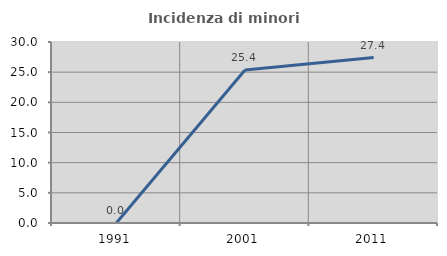
| Category | Incidenza di minori stranieri |
|---|---|
| 1991.0 | 0 |
| 2001.0 | 25.373 |
| 2011.0 | 27.419 |